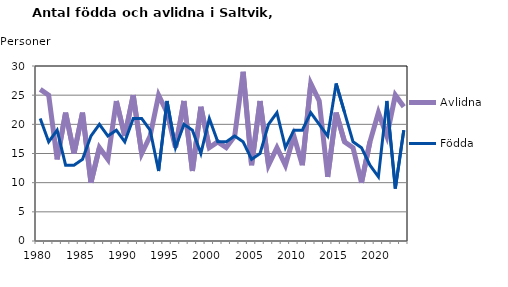
| Category | Avlidna | Födda |
|---|---|---|
| 1980.0 | 26 | 21 |
| 1981.0 | 25 | 17 |
| 1982.0 | 14 | 19 |
| 1983.0 | 22 | 13 |
| 1984.0 | 15 | 13 |
| 1985.0 | 22 | 14 |
| 1986.0 | 10 | 18 |
| 1987.0 | 16 | 20 |
| 1988.0 | 14 | 18 |
| 1989.0 | 24 | 19 |
| 1990.0 | 18 | 17 |
| 1991.0 | 25 | 21 |
| 1992.0 | 15 | 21 |
| 1993.0 | 18 | 19 |
| 1994.0 | 25 | 12 |
| 1995.0 | 22 | 24 |
| 1996.0 | 16 | 16 |
| 1997.0 | 24 | 20 |
| 1998.0 | 12 | 19 |
| 1999.0 | 23 | 15 |
| 2000.0 | 16 | 21 |
| 2001.0 | 17 | 17 |
| 2002.0 | 16 | 17 |
| 2003.0 | 18 | 18 |
| 2004.0 | 29 | 17 |
| 2005.0 | 13 | 14 |
| 2006.0 | 24 | 15 |
| 2007.0 | 13 | 20 |
| 2008.0 | 16 | 22 |
| 2009.0 | 13 | 16 |
| 2010.0 | 18 | 19 |
| 2011.0 | 13 | 19 |
| 2012.0 | 27 | 22 |
| 2013.0 | 24 | 20 |
| 2014.0 | 11 | 18 |
| 2015.0 | 22 | 27 |
| 2016.0 | 17 | 22 |
| 2017.0 | 16 | 17 |
| 2018.0 | 10 | 16 |
| 2019.0 | 17 | 13 |
| 2020.0 | 22 | 11 |
| 2021.0 | 18 | 24 |
| 2022.0 | 25 | 9 |
| 2023.0 | 23 | 19 |